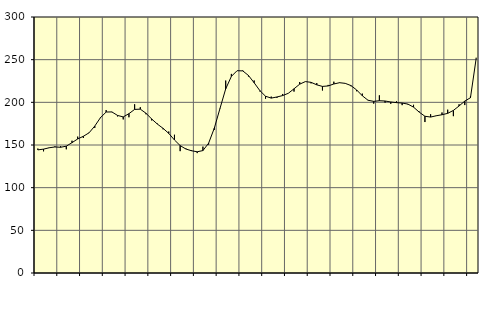
| Category | Piggar | Series 1 |
|---|---|---|
| nan | 145.8 | 144.28 |
| 1.0 | 142.6 | 145.16 |
| 1.0 | 147 | 146.76 |
| 1.0 | 148.4 | 147.7 |
| nan | 148.6 | 147.31 |
| 2.0 | 145 | 148.63 |
| 2.0 | 155 | 152.76 |
| 2.0 | 159.8 | 157.08 |
| nan | 158.2 | 160.23 |
| 3.0 | 164 | 164.3 |
| 3.0 | 170.1 | 172.21 |
| 3.0 | 182.7 | 182.03 |
| nan | 190.9 | 188.63 |
| 4.0 | 188.5 | 188.77 |
| 4.0 | 183.5 | 184.65 |
| 4.0 | 180 | 182.91 |
| nan | 182.5 | 186.7 |
| 5.0 | 197.7 | 191.7 |
| 5.0 | 194.3 | 192.01 |
| 5.0 | 186 | 187.19 |
| nan | 178.8 | 180.48 |
| 6.0 | 175.1 | 174.49 |
| 6.0 | 168.4 | 169.53 |
| 6.0 | 165.8 | 163.57 |
| nan | 162 | 155.88 |
| 7.0 | 142.8 | 149.31 |
| 7.0 | 145.9 | 145.3 |
| 7.0 | 143.9 | 143.25 |
| nan | 140.5 | 142.07 |
| 8.0 | 148.1 | 143.46 |
| 8.0 | 150.5 | 152.13 |
| 8.0 | 167.7 | 169.71 |
| nan | 193.3 | 192.89 |
| 9.0 | 225.5 | 215.78 |
| 9.0 | 233.3 | 230.41 |
| 9.0 | 237.1 | 237.07 |
| nan | 237.4 | 236.83 |
| 10.0 | 230.3 | 231.48 |
| 10.0 | 225.6 | 222.92 |
| 10.0 | 212.8 | 213.74 |
| nan | 204.2 | 207.13 |
| 11.0 | 206.7 | 204.96 |
| 11.0 | 205.3 | 206.28 |
| 11.0 | 209.8 | 207.9 |
| nan | 210.6 | 210.58 |
| 12.0 | 212.6 | 215.86 |
| 12.0 | 223.8 | 221.29 |
| 12.0 | 224.4 | 224.31 |
| nan | 222.2 | 223.43 |
| 13.0 | 222.6 | 220.5 |
| 13.0 | 213.9 | 218.65 |
| 13.0 | 220.4 | 219.21 |
| nan | 224.2 | 221.52 |
| 14.0 | 223.3 | 222.99 |
| 14.0 | 222.1 | 222.24 |
| 14.0 | 218.9 | 219.65 |
| nan | 213 | 214.52 |
| 15.0 | 210.2 | 207.7 |
| 15.0 | 202.6 | 202.45 |
| 15.0 | 198.5 | 201.13 |
| nan | 208.2 | 201.88 |
| 16.0 | 199.7 | 201.55 |
| 16.0 | 198.3 | 200.41 |
| 16.0 | 201.2 | 199.67 |
| nan | 196.7 | 199.16 |
| 17.0 | 197.5 | 197.96 |
| 17.0 | 197.1 | 194.37 |
| 17.0 | 189.2 | 188.5 |
| nan | 176.9 | 183.69 |
| 18.0 | 186 | 182.74 |
| 18.0 | 184 | 184.26 |
| 18.0 | 188.1 | 185.46 |
| nan | 191.4 | 187.09 |
| 19.0 | 183.8 | 190.52 |
| 19.0 | 197.7 | 195.73 |
| 19.0 | 196.8 | 201.45 |
| nan | 207.1 | 205.38 |
| 20.0 | 252.2 | 251.28 |